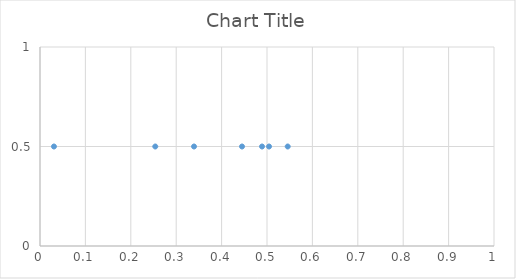
| Category | Series 0 |
|---|---|
| 0.5044497063554367 | 0.5 |
| 0.25390470044473845 | 0.5 |
| 0.030736386177252717 | 0.5 |
| 0.4449727996001437 | 0.5 |
| 0.3392454290072643 | 0.5 |
| 0.48909117982421657 | 0.5 |
| 0.5456082160818332 | 0.5 |